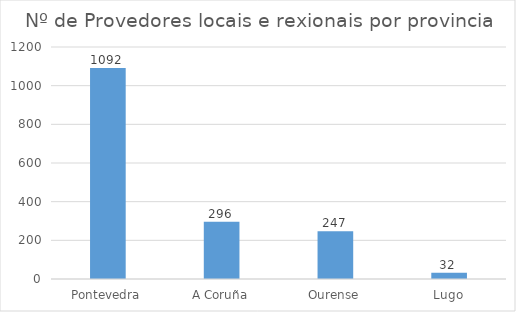
| Category | Series 0 |
|---|---|
| Pontevedra | 1092 |
| A Coruña | 296 |
| Ourense | 247 |
| Lugo | 32 |